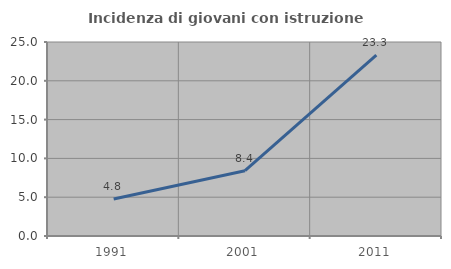
| Category | Incidenza di giovani con istruzione universitaria |
|---|---|
| 1991.0 | 4.779 |
| 2001.0 | 8.411 |
| 2011.0 | 23.308 |